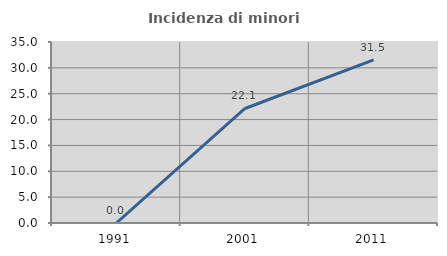
| Category | Incidenza di minori stranieri |
|---|---|
| 1991.0 | 0 |
| 2001.0 | 22.143 |
| 2011.0 | 31.546 |